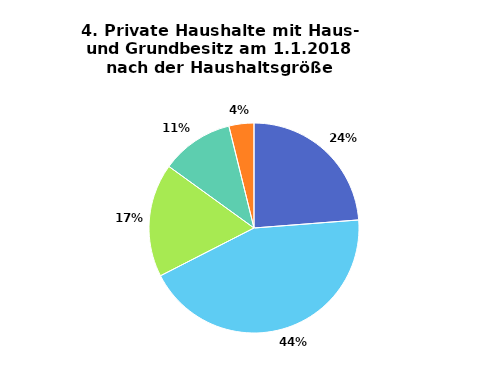
| Category | Series 1 |
|---|---|
| 1- Personenhaushalt | 0.238 |
| 2- Personenhaushalt | 0.437 |
| 3- Personenhaushalt | 0.175 |
| 4- Personenhaushalt | 0.112 |
| Haushalte mit 5 und mehr Personen | 0.038 |